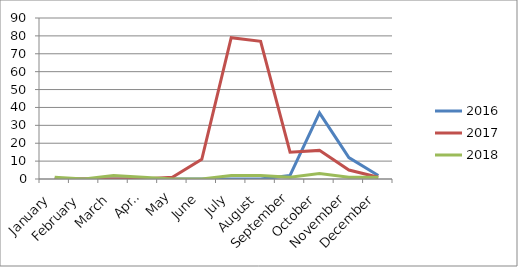
| Category | 2016 | 2017 | 2018 |
|---|---|---|---|
| January | 0 | 0 | 1 |
| February | 0 | 0 | 0 |
| March | 0 | 0 | 2 |
| April | 0 | 0 | 1 |
| May | 0 | 1 | 0 |
| June | 0 | 11 | 0 |
| July | 0 | 79 | 2 |
| August | 0 | 77 | 2 |
| September | 2 | 15 | 1 |
| October | 37 | 16 | 3 |
| November | 12 | 5 | 1 |
| December | 2 | 1 | 1 |